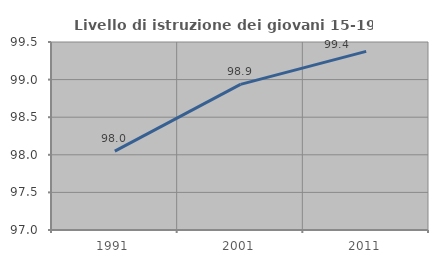
| Category | Livello di istruzione dei giovani 15-19 anni |
|---|---|
| 1991.0 | 98.049 |
| 2001.0 | 98.936 |
| 2011.0 | 99.375 |